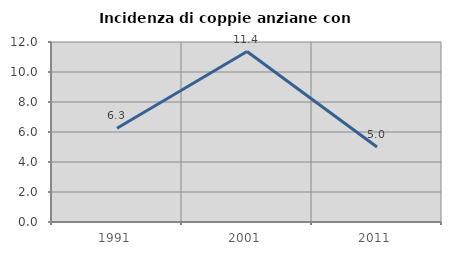
| Category | Incidenza di coppie anziane con figli |
|---|---|
| 1991.0 | 6.25 |
| 2001.0 | 11.364 |
| 2011.0 | 5 |